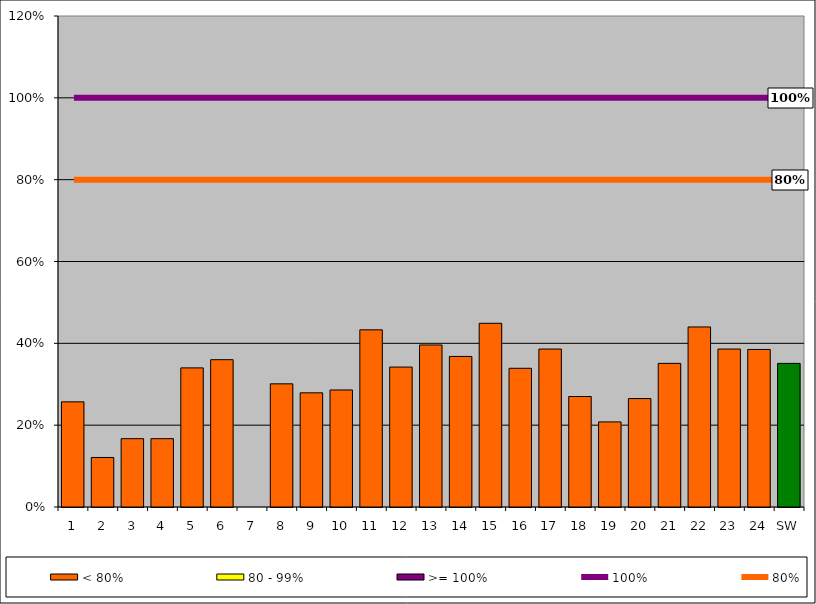
| Category | < 80% | 80 - 99% | >= 100% |
|---|---|---|---|
| 1 | 0.257 | 0 | 0 |
| 2 | 0.121 | 0 | 0 |
| 3 | 0.167 | 0 | 0 |
| 4 | 0.167 | 0 | 0 |
| 5 | 0.34 | 0 | 0 |
| 6 | 0.36 | 0 | 0 |
| 7 | 0 | 0 | 0 |
| 8 | 0.301 | 0 | 0 |
| 9 | 0.279 | 0 | 0 |
| 10 | 0.286 | 0 | 0 |
| 11 | 0.433 | 0 | 0 |
| 12 | 0.342 | 0 | 0 |
| 13 | 0.396 | 0 | 0 |
| 14 | 0.368 | 0 | 0 |
| 15 | 0.449 | 0 | 0 |
| 16 | 0.339 | 0 | 0 |
| 17 | 0.386 | 0 | 0 |
| 18 | 0.27 | 0 | 0 |
| 19 | 0.208 | 0 | 0 |
| 20 | 0.265 | 0 | 0 |
| 21 | 0.351 | 0 | 0 |
| 22 | 0.44 | 0 | 0 |
| 23 | 0.386 | 0 | 0 |
| 24 | 0.385 | 0 | 0 |
| SW | 0.351 | 0 | 0 |